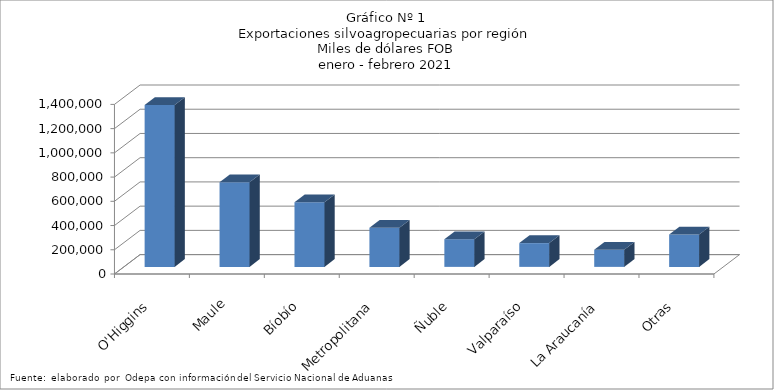
| Category | Series 0 |
|---|---|
| O'Higgins | 1336257.815 |
| Maule | 698863.186 |
| Bíobío | 534246.362 |
| Metropolitana | 323625.17 |
| Ñuble | 228398.65 |
| Valparaíso | 196162.722 |
| La Araucanía | 141305.478 |
| Otras | 267341.317 |